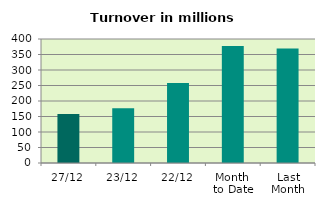
| Category | Series 0 |
|---|---|
| 27/12 | 158.085 |
| 23/12 | 176.543 |
| 22/12 | 258.225 |
| Month 
to Date | 377.068 |
| Last
Month | 369.747 |